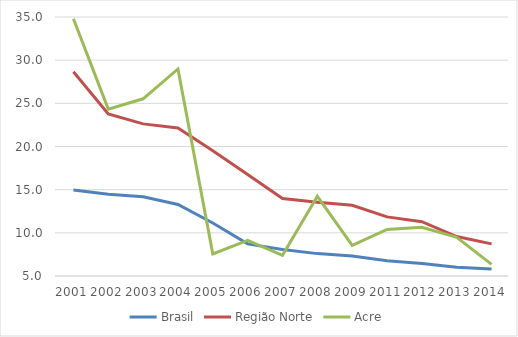
| Category | Brasil | Região Norte | Acre |
|---|---|---|---|
| 2001.0 | 14.955 | 28.66 | 34.793 |
| 2002.0 | 14.475 | 23.779 | 24.328 |
| 2003.0 | 14.19 | 22.619 | 25.527 |
| 2004.0 | 13.285 | 22.145 | 28.982 |
| 2005.0 | 11.14 | 19.518 | 7.546 |
| 2006.0 | 8.721 | 16.753 | 9.117 |
| 2007.0 | 8.08 | 13.97 | 7.402 |
| 2008.0 | 7.593 | 13.543 | 14.231 |
| 2009.0 | 7.309 | 13.198 | 8.559 |
| 2011.0 | 6.776 | 11.848 | 10.396 |
| 2012.0 | 6.452 | 11.29 | 10.653 |
| 2013.0 | 6.009 | 9.568 | 9.47 |
| 2014.0 | 5.816 | 8.718 | 6.353 |